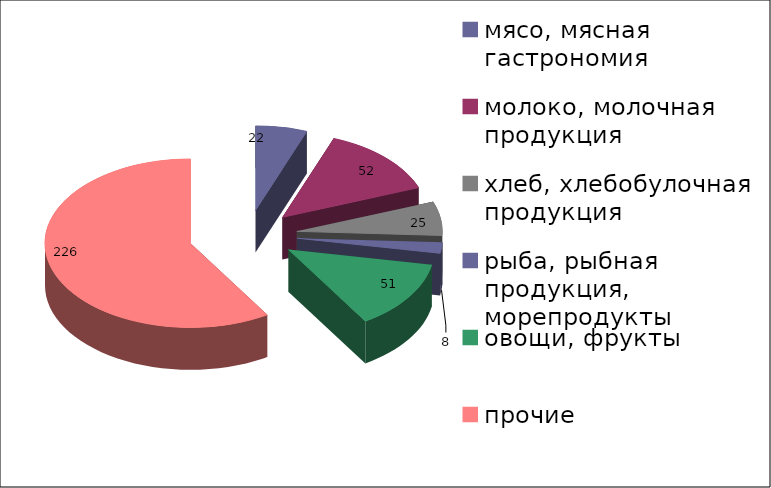
| Category | Series 0 |
|---|---|
| мясо, мясная гастрономия | 22 |
| молоко, молочная продукция | 52 |
| хлеб, хлебобулочная продукция | 25 |
| рыба, рыбная продукция, морепродукты | 8 |
| овощи, фрукты | 51 |
| прочие | 226 |